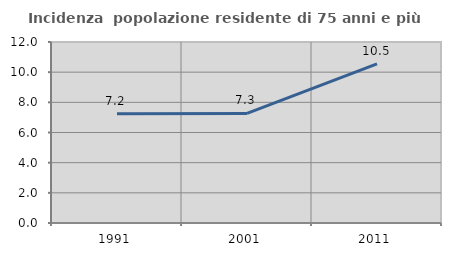
| Category | Incidenza  popolazione residente di 75 anni e più |
|---|---|
| 1991.0 | 7.242 |
| 2001.0 | 7.263 |
| 2011.0 | 10.548 |